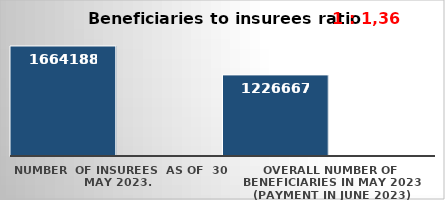
| Category | Series 0 | Series 1 |
|---|---|---|
| NUMBER  of insurees  as of  30 May 2023. | 1664188 |  |
| OVERALL number of beneficiaries in May 2023 (payment in June 2023) | 1226667 |  |